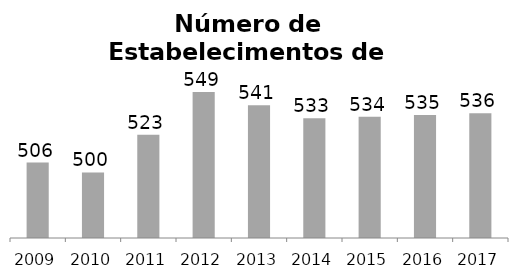
| Category | Transporte |
|---|---|
| 2009.0 | 506 |
| 2010.0 | 500 |
| 2011.0 | 523 |
| 2012.0 | 549 |
| 2013.0 | 541 |
| 2014.0 | 533 |
| 2015.0 | 534 |
| 2016.0 | 535 |
| 2017.0 | 536 |